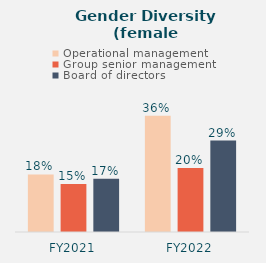
| Category | Operational management | Group senior management | Board of directors |
|---|---|---|---|
| FY2021 | 0.18 | 0.15 | 0.167 |
| FY2022 | 0.364 | 0.2 | 0.286 |